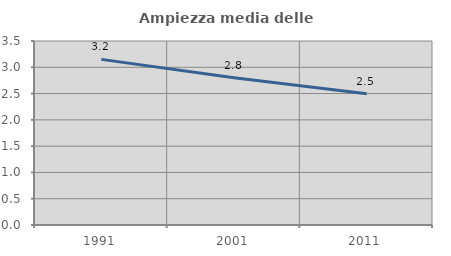
| Category | Ampiezza media delle famiglie |
|---|---|
| 1991.0 | 3.15 |
| 2001.0 | 2.8 |
| 2011.0 | 2.498 |